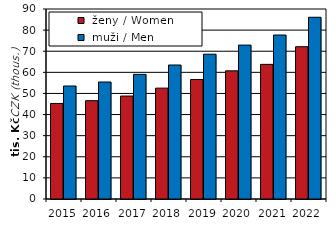
| Category |  ženy / Women |  muži / Men |
|---|---|---|
| 2015.0 | 45.258 | 53.532 |
| 2016.0 | 46.571 | 55.416 |
| 2017.0 | 48.77 | 59.041 |
| 2018.0 | 52.517 | 63.469 |
| 2019.0 | 56.583 | 68.582 |
| 2020.0 | 60.703 | 72.901 |
| 2021.0 | 63.77 | 77.681 |
| 2022.0 | 72.137 | 86.081 |